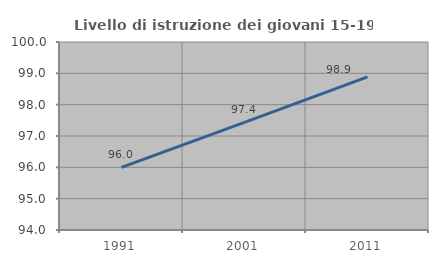
| Category | Livello di istruzione dei giovani 15-19 anni |
|---|---|
| 1991.0 | 96 |
| 2001.0 | 97.436 |
| 2011.0 | 98.889 |